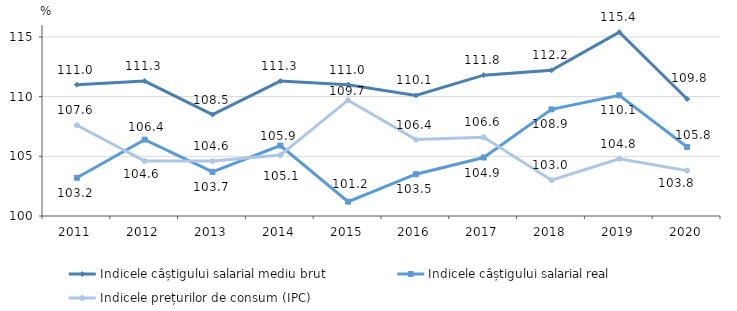
| Category | Indicele câștigului salarial mediu brut | Indicele câștigului salarial real | Indicele prețurilor de consum (IPC) |
|---|---|---|---|
| 2011.0 | 111 | 103.2 | 107.6 |
| 2012.0 | 111.3 | 106.4 | 104.6 |
| 2013.0 | 108.5 | 103.7 | 104.6 |
| 2014.0 | 111.3 | 105.9 | 105.1 |
| 2015.0 | 111 | 101.2 | 109.7 |
| 2016.0 | 110.1 | 103.5 | 106.4 |
| 2017.0 | 111.8 | 104.9 | 106.6 |
| 2018.0 | 112.2 | 108.932 | 103 |
| 2019.0 | 115.4 | 110.115 | 104.8 |
| 2020.0 | 109.8 | 105.78 | 103.8 |